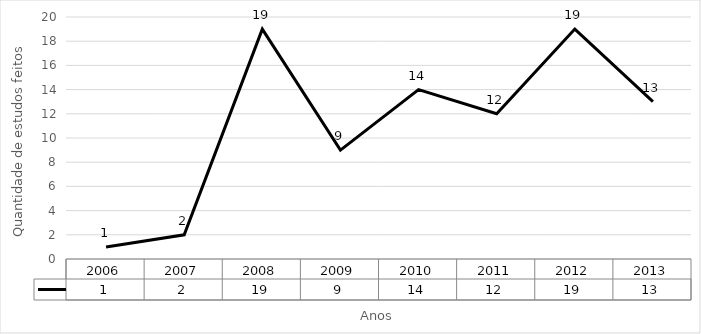
| Category | Series 0 |
|---|---|
| 2006.0 | 1 |
| 2007.0 | 2 |
| 2008.0 | 19 |
| 2009.0 | 9 |
| 2010.0 | 14 |
| 2011.0 | 12 |
| 2012.0 | 19 |
| 2013.0 | 13 |